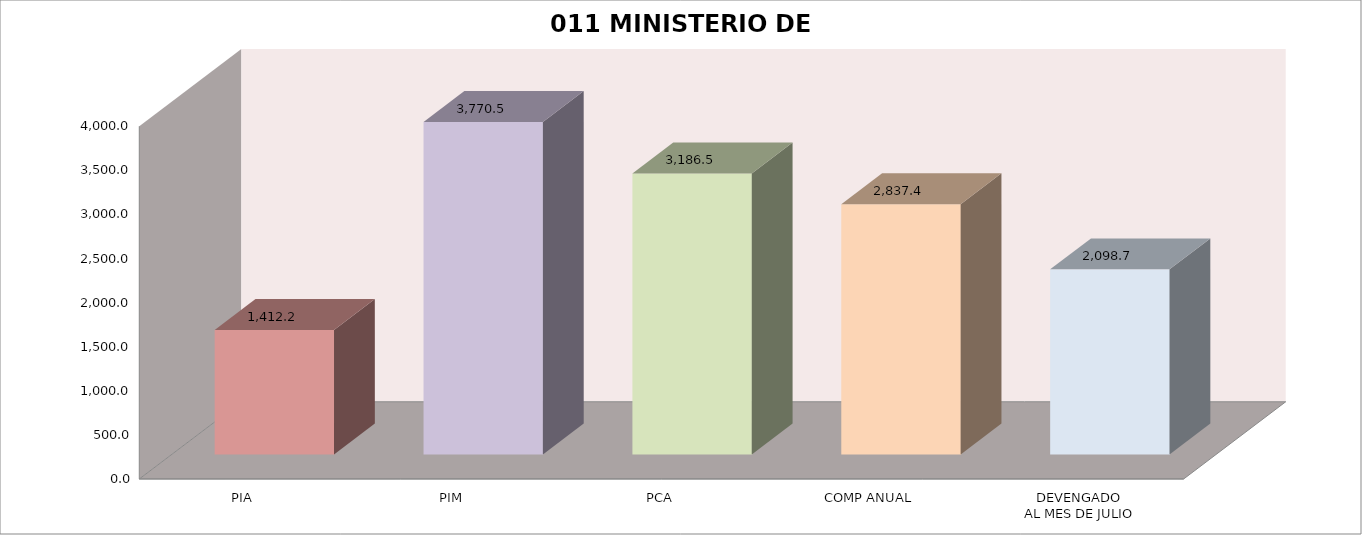
| Category | 011 MINISTERIO DE SALUD |
|---|---|
| PIA | 1412.218 |
| PIM | 3770.53 |
| PCA | 3186.524 |
| COMP ANUAL | 2837.357 |
| DEVENGADO
AL MES DE JULIO | 2098.674 |